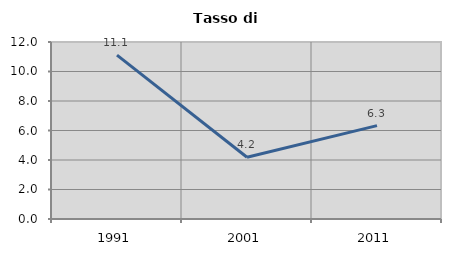
| Category | Tasso di disoccupazione   |
|---|---|
| 1991.0 | 11.111 |
| 2001.0 | 4.188 |
| 2011.0 | 6.329 |